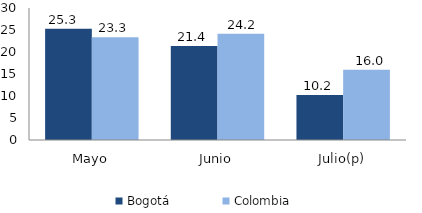
| Category | Bogotá | Colombia |
|---|---|---|
| Mayo | 25.31 | 23.336 |
| Junio | 21.363 | 24.154 |
| Julio(p) | 10.208 | 15.99 |